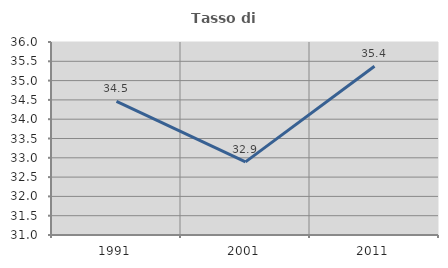
| Category | Tasso di occupazione   |
|---|---|
| 1991.0 | 34.464 |
| 2001.0 | 32.893 |
| 2011.0 | 35.371 |